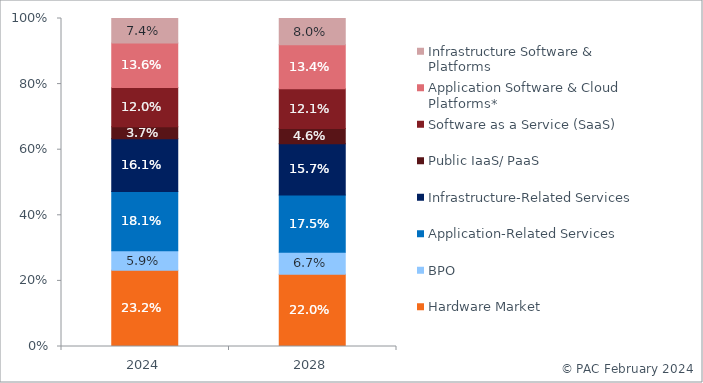
| Category | Hardware Market | BPO | Application-Related Services | Infrastructure-Related Services | Public IaaS/ PaaS | Software as a Service (SaaS) | Application Software & Cloud Platforms* | Infrastructure Software & Platforms |
|---|---|---|---|---|---|---|---|---|
| 2024.0 | 0.232 | 0.059 | 0.181 | 0.161 | 0.037 | 0.12 | 0.136 | 0.074 |
| 2028.0 | 0.22 | 0.067 | 0.175 | 0.157 | 0.046 | 0.121 | 0.134 | 0.08 |